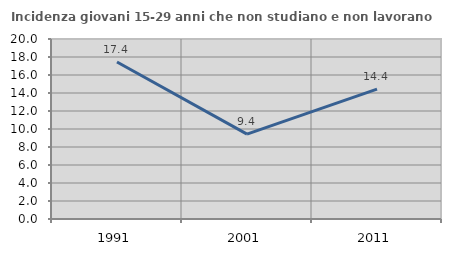
| Category | Incidenza giovani 15-29 anni che non studiano e non lavorano  |
|---|---|
| 1991.0 | 17.447 |
| 2001.0 | 9.429 |
| 2011.0 | 14.439 |